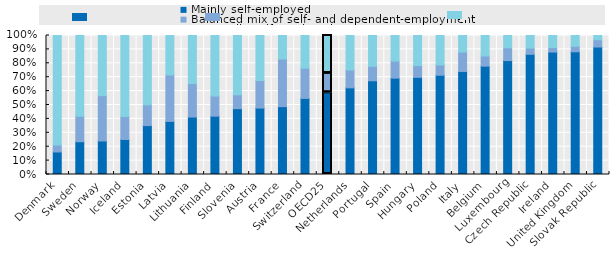
| Category | Mainly self-employed | Balanced mix of self- and dependent-employment | Marginally self-employed |
|---|---|---|---|
| Denmark | 0.162 | 0.05 | 0.788 |
| Sweden | 0.236 | 0.183 | 0.581 |
| Norway | 0.241 | 0.326 | 0.433 |
| Iceland | 0.252 | 0.165 | 0.584 |
| Estonia | 0.352 | 0.149 | 0.499 |
| Latvia | 0.382 | 0.334 | 0.284 |
| Lithuania | 0.413 | 0.241 | 0.346 |
| Finland | 0.42 | 0.145 | 0.435 |
| Slovenia | 0.474 | 0.1 | 0.426 |
| Austria | 0.478 | 0.198 | 0.324 |
| France | 0.488 | 0.343 | 0.169 |
| Switzerland | 0.547 | 0.217 | 0.235 |
| OECD25 | 0.588 | 0.138 | 0.274 |
| Netherlands | 0.623 | 0.128 | 0.249 |
| Portugal | 0.674 | 0.104 | 0.222 |
| Spain | 0.693 | 0.123 | 0.184 |
| Hungary | 0.699 | 0.084 | 0.217 |
| Poland | 0.714 | 0.074 | 0.212 |
| Italy | 0.741 | 0.14 | 0.119 |
| Belgium | 0.779 | 0.073 | 0.148 |
| Luxembourg | 0.819 | 0.092 | 0.088 |
| Czech Republic | 0.865 | 0.045 | 0.091 |
| Ireland | 0.881 | 0.032 | 0.087 |
| United Kingdom | 0.883 | 0.04 | 0.077 |
| Slovak Republic | 0.917 | 0.052 | 0.031 |